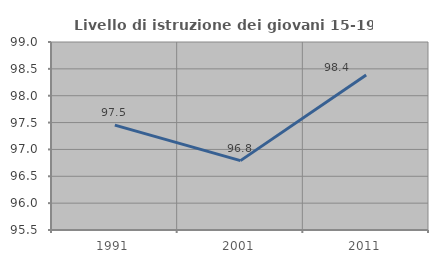
| Category | Livello di istruzione dei giovani 15-19 anni |
|---|---|
| 1991.0 | 97.452 |
| 2001.0 | 96.791 |
| 2011.0 | 98.387 |